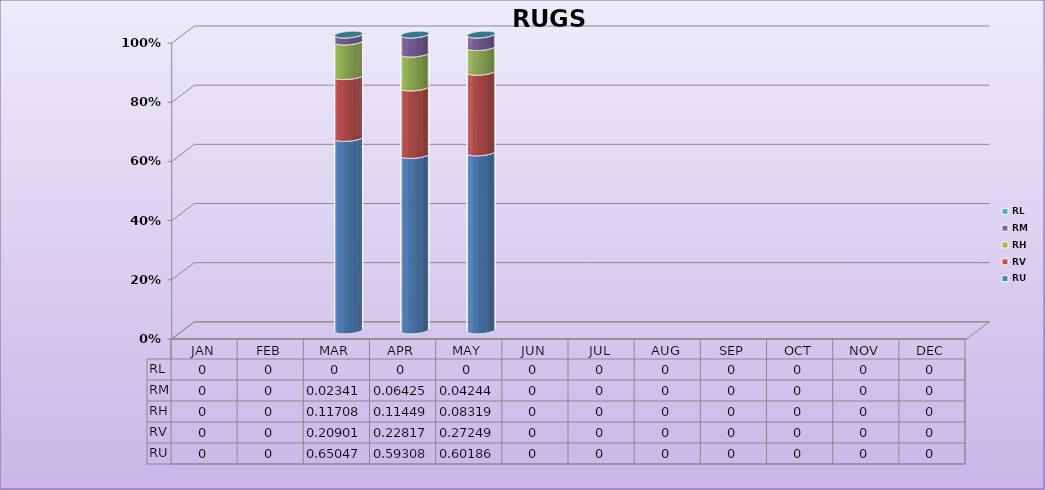
| Category | RU | RV | RH | RM | RL |
|---|---|---|---|---|---|
| 0 | 0 | 0 | 0 | 0 | 0 |
| 1 | 0 | 0 | 0 | 0 | 0 |
| 2 | 0.65 | 0.209 | 0.117 | 0.023 | 0 |
| 3 | 0.593 | 0.228 | 0.114 | 0.064 | 0 |
| 4 | 0.602 | 0.272 | 0.083 | 0.042 | 0 |
| 5 | 0 | 0 | 0 | 0 | 0 |
| 6 | 0 | 0 | 0 | 0 | 0 |
| 7 | 0 | 0 | 0 | 0 | 0 |
| 8 | 0 | 0 | 0 | 0 | 0 |
| 9 | 0 | 0 | 0 | 0 | 0 |
| 10 | 0 | 0 | 0 | 0 | 0 |
| 11 | 0 | 0 | 0 | 0 | 0 |